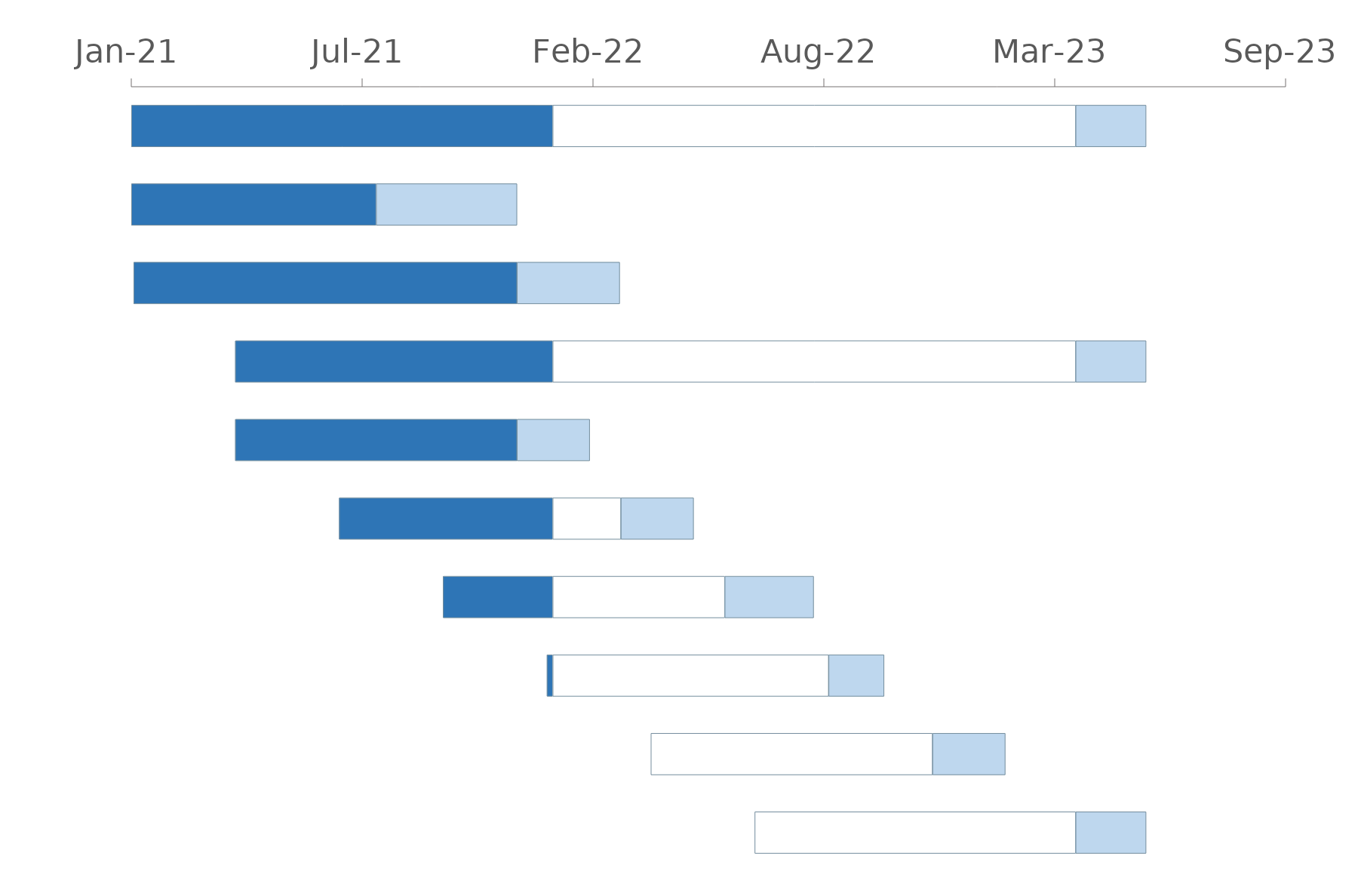
| Category | Start Point | Elapsed Time | Remaining Time | Delay |
|---|---|---|---|---|
| Project Overall | 2021-01-01 | 365 | 453 | 61 |
| Engineering | 2021-01-01 | 212 | 0 | 122 |
| Procurement | 2021-01-03 | 332 | 0 | 89 |
| Construction | 2021-04-01 | 275 | 453 | 61 |
| Main Package 1 | 2021-04-01 | 244 | 0 | 63 |
| Main Package 2 | 2021-06-30 | 185 | 59 | 63 |
| Main Package 3 | 2021-09-28 | 95 | 149 | 77 |
| Main Package 4 | 2021-12-27 | 5 | 239 | 48 |
| Main Package 5 | 2022-03-27 | 0 | 244 | 63 |
| Main Package 6 | 2022-06-25 | 0 | 278 | 61 |